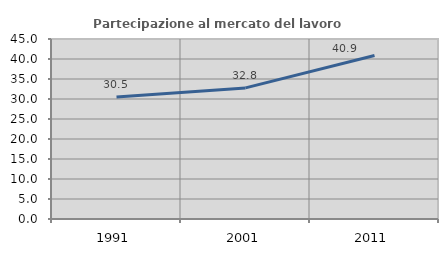
| Category | Partecipazione al mercato del lavoro  femminile |
|---|---|
| 1991.0 | 30.478 |
| 2001.0 | 32.772 |
| 2011.0 | 40.86 |